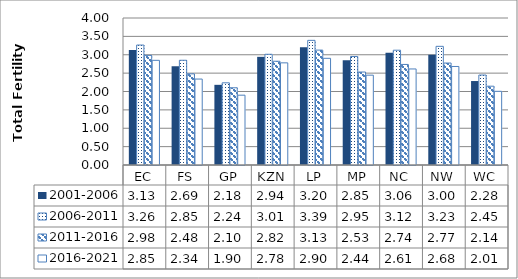
| Category | 2001-2006 | 2006-2011 | 2011-2016 | 2016-2021 |
|---|---|---|---|---|
| EC | 3.131 | 3.264 | 2.983 | 2.848 |
| FS | 2.688 | 2.85 | 2.48 | 2.339 |
| GP | 2.181 | 2.236 | 2.101 | 1.9 |
| KZN | 2.943 | 3.013 | 2.823 | 2.78 |
| LP | 3.202 | 3.392 | 3.126 | 2.903 |
| MP | 2.85 | 2.953 | 2.53 | 2.445 |
| NC | 3.056 | 3.124 | 2.736 | 2.613 |
| NW | 2.998 | 3.229 | 2.775 | 2.681 |
| WC | 2.285 | 2.448 | 2.144 | 2.005 |